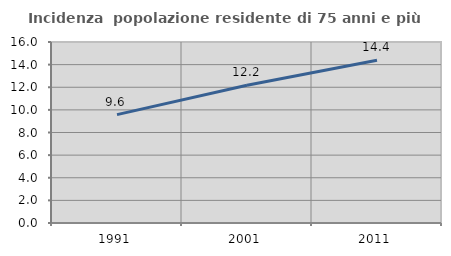
| Category | Incidenza  popolazione residente di 75 anni e più |
|---|---|
| 1991.0 | 9.577 |
| 2001.0 | 12.171 |
| 2011.0 | 14.381 |